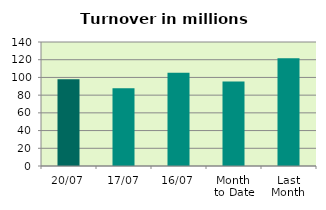
| Category | Series 0 |
|---|---|
| 20/07 | 97.982 |
| 17/07 | 87.906 |
| 16/07 | 105.188 |
| Month 
to Date | 95.307 |
| Last
Month | 121.74 |